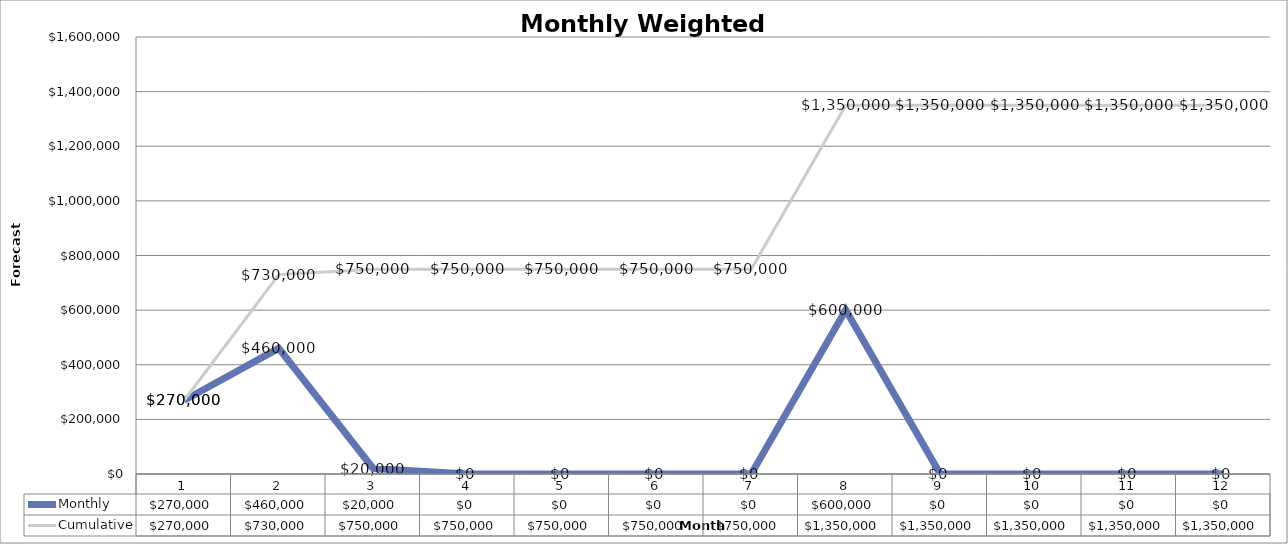
| Category | Monthly | Cumulative |
|---|---|---|
| 0 | 270000 | 270000 |
| 1 | 460000 | 730000 |
| 2 | 20000 | 750000 |
| 3 | 0 | 750000 |
| 4 | 0 | 750000 |
| 5 | 0 | 750000 |
| 6 | 0 | 750000 |
| 7 | 600000 | 1350000 |
| 8 | 0 | 1350000 |
| 9 | 0 | 1350000 |
| 10 | 0 | 1350000 |
| 11 | 0 | 1350000 |